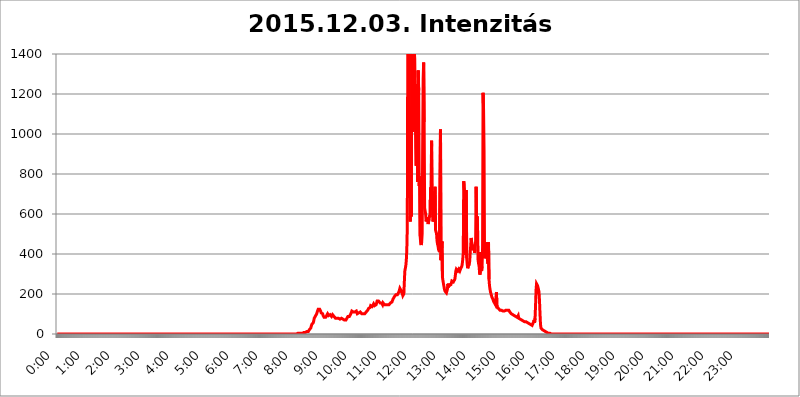
| Category | 2015.12.03. Intenzitás [W/m^2] |
|---|---|
| 0.0 | 0 |
| 0.0006944444444444445 | 0 |
| 0.001388888888888889 | 0 |
| 0.0020833333333333333 | 0 |
| 0.002777777777777778 | 0 |
| 0.003472222222222222 | 0 |
| 0.004166666666666667 | 0 |
| 0.004861111111111111 | 0 |
| 0.005555555555555556 | 0 |
| 0.0062499999999999995 | 0 |
| 0.006944444444444444 | 0 |
| 0.007638888888888889 | 0 |
| 0.008333333333333333 | 0 |
| 0.009027777777777779 | 0 |
| 0.009722222222222222 | 0 |
| 0.010416666666666666 | 0 |
| 0.011111111111111112 | 0 |
| 0.011805555555555555 | 0 |
| 0.012499999999999999 | 0 |
| 0.013194444444444444 | 0 |
| 0.013888888888888888 | 0 |
| 0.014583333333333332 | 0 |
| 0.015277777777777777 | 0 |
| 0.015972222222222224 | 0 |
| 0.016666666666666666 | 0 |
| 0.017361111111111112 | 0 |
| 0.018055555555555557 | 0 |
| 0.01875 | 0 |
| 0.019444444444444445 | 0 |
| 0.02013888888888889 | 0 |
| 0.020833333333333332 | 0 |
| 0.02152777777777778 | 0 |
| 0.022222222222222223 | 0 |
| 0.02291666666666667 | 0 |
| 0.02361111111111111 | 0 |
| 0.024305555555555556 | 0 |
| 0.024999999999999998 | 0 |
| 0.025694444444444447 | 0 |
| 0.02638888888888889 | 0 |
| 0.027083333333333334 | 0 |
| 0.027777777777777776 | 0 |
| 0.02847222222222222 | 0 |
| 0.029166666666666664 | 0 |
| 0.029861111111111113 | 0 |
| 0.030555555555555555 | 0 |
| 0.03125 | 0 |
| 0.03194444444444445 | 0 |
| 0.03263888888888889 | 0 |
| 0.03333333333333333 | 0 |
| 0.034027777777777775 | 0 |
| 0.034722222222222224 | 0 |
| 0.035416666666666666 | 0 |
| 0.036111111111111115 | 0 |
| 0.03680555555555556 | 0 |
| 0.0375 | 0 |
| 0.03819444444444444 | 0 |
| 0.03888888888888889 | 0 |
| 0.03958333333333333 | 0 |
| 0.04027777777777778 | 0 |
| 0.04097222222222222 | 0 |
| 0.041666666666666664 | 0 |
| 0.042361111111111106 | 0 |
| 0.04305555555555556 | 0 |
| 0.043750000000000004 | 0 |
| 0.044444444444444446 | 0 |
| 0.04513888888888889 | 0 |
| 0.04583333333333334 | 0 |
| 0.04652777777777778 | 0 |
| 0.04722222222222222 | 0 |
| 0.04791666666666666 | 0 |
| 0.04861111111111111 | 0 |
| 0.049305555555555554 | 0 |
| 0.049999999999999996 | 0 |
| 0.05069444444444445 | 0 |
| 0.051388888888888894 | 0 |
| 0.052083333333333336 | 0 |
| 0.05277777777777778 | 0 |
| 0.05347222222222222 | 0 |
| 0.05416666666666667 | 0 |
| 0.05486111111111111 | 0 |
| 0.05555555555555555 | 0 |
| 0.05625 | 0 |
| 0.05694444444444444 | 0 |
| 0.057638888888888885 | 0 |
| 0.05833333333333333 | 0 |
| 0.05902777777777778 | 0 |
| 0.059722222222222225 | 0 |
| 0.06041666666666667 | 0 |
| 0.061111111111111116 | 0 |
| 0.06180555555555556 | 0 |
| 0.0625 | 0 |
| 0.06319444444444444 | 0 |
| 0.06388888888888888 | 0 |
| 0.06458333333333334 | 0 |
| 0.06527777777777778 | 0 |
| 0.06597222222222222 | 0 |
| 0.06666666666666667 | 0 |
| 0.06736111111111111 | 0 |
| 0.06805555555555555 | 0 |
| 0.06874999999999999 | 0 |
| 0.06944444444444443 | 0 |
| 0.07013888888888889 | 0 |
| 0.07083333333333333 | 0 |
| 0.07152777777777779 | 0 |
| 0.07222222222222223 | 0 |
| 0.07291666666666667 | 0 |
| 0.07361111111111111 | 0 |
| 0.07430555555555556 | 0 |
| 0.075 | 0 |
| 0.07569444444444444 | 0 |
| 0.0763888888888889 | 0 |
| 0.07708333333333334 | 0 |
| 0.07777777777777778 | 0 |
| 0.07847222222222222 | 0 |
| 0.07916666666666666 | 0 |
| 0.0798611111111111 | 0 |
| 0.08055555555555556 | 0 |
| 0.08125 | 0 |
| 0.08194444444444444 | 0 |
| 0.08263888888888889 | 0 |
| 0.08333333333333333 | 0 |
| 0.08402777777777777 | 0 |
| 0.08472222222222221 | 0 |
| 0.08541666666666665 | 0 |
| 0.08611111111111112 | 0 |
| 0.08680555555555557 | 0 |
| 0.08750000000000001 | 0 |
| 0.08819444444444445 | 0 |
| 0.08888888888888889 | 0 |
| 0.08958333333333333 | 0 |
| 0.09027777777777778 | 0 |
| 0.09097222222222222 | 0 |
| 0.09166666666666667 | 0 |
| 0.09236111111111112 | 0 |
| 0.09305555555555556 | 0 |
| 0.09375 | 0 |
| 0.09444444444444444 | 0 |
| 0.09513888888888888 | 0 |
| 0.09583333333333333 | 0 |
| 0.09652777777777777 | 0 |
| 0.09722222222222222 | 0 |
| 0.09791666666666667 | 0 |
| 0.09861111111111111 | 0 |
| 0.09930555555555555 | 0 |
| 0.09999999999999999 | 0 |
| 0.10069444444444443 | 0 |
| 0.1013888888888889 | 0 |
| 0.10208333333333335 | 0 |
| 0.10277777777777779 | 0 |
| 0.10347222222222223 | 0 |
| 0.10416666666666667 | 0 |
| 0.10486111111111111 | 0 |
| 0.10555555555555556 | 0 |
| 0.10625 | 0 |
| 0.10694444444444444 | 0 |
| 0.1076388888888889 | 0 |
| 0.10833333333333334 | 0 |
| 0.10902777777777778 | 0 |
| 0.10972222222222222 | 0 |
| 0.1111111111111111 | 0 |
| 0.11180555555555556 | 0 |
| 0.11180555555555556 | 0 |
| 0.1125 | 0 |
| 0.11319444444444444 | 0 |
| 0.11388888888888889 | 0 |
| 0.11458333333333333 | 0 |
| 0.11527777777777777 | 0 |
| 0.11597222222222221 | 0 |
| 0.11666666666666665 | 0 |
| 0.1173611111111111 | 0 |
| 0.11805555555555557 | 0 |
| 0.11944444444444445 | 0 |
| 0.12013888888888889 | 0 |
| 0.12083333333333333 | 0 |
| 0.12152777777777778 | 0 |
| 0.12222222222222223 | 0 |
| 0.12291666666666667 | 0 |
| 0.12291666666666667 | 0 |
| 0.12361111111111112 | 0 |
| 0.12430555555555556 | 0 |
| 0.125 | 0 |
| 0.12569444444444444 | 0 |
| 0.12638888888888888 | 0 |
| 0.12708333333333333 | 0 |
| 0.16875 | 0 |
| 0.12847222222222224 | 0 |
| 0.12916666666666668 | 0 |
| 0.12986111111111112 | 0 |
| 0.13055555555555556 | 0 |
| 0.13125 | 0 |
| 0.13194444444444445 | 0 |
| 0.1326388888888889 | 0 |
| 0.13333333333333333 | 0 |
| 0.13402777777777777 | 0 |
| 0.13402777777777777 | 0 |
| 0.13472222222222222 | 0 |
| 0.13541666666666666 | 0 |
| 0.1361111111111111 | 0 |
| 0.13749999999999998 | 0 |
| 0.13819444444444443 | 0 |
| 0.1388888888888889 | 0 |
| 0.13958333333333334 | 0 |
| 0.14027777777777778 | 0 |
| 0.14097222222222222 | 0 |
| 0.14166666666666666 | 0 |
| 0.1423611111111111 | 0 |
| 0.14305555555555557 | 0 |
| 0.14375000000000002 | 0 |
| 0.14444444444444446 | 0 |
| 0.1451388888888889 | 0 |
| 0.1451388888888889 | 0 |
| 0.14652777777777778 | 0 |
| 0.14722222222222223 | 0 |
| 0.14791666666666667 | 0 |
| 0.1486111111111111 | 0 |
| 0.14930555555555555 | 0 |
| 0.15 | 0 |
| 0.15069444444444444 | 0 |
| 0.15138888888888888 | 0 |
| 0.15208333333333332 | 0 |
| 0.15277777777777776 | 0 |
| 0.15347222222222223 | 0 |
| 0.15416666666666667 | 0 |
| 0.15486111111111112 | 0 |
| 0.15555555555555556 | 0 |
| 0.15625 | 0 |
| 0.15694444444444444 | 0 |
| 0.15763888888888888 | 0 |
| 0.15833333333333333 | 0 |
| 0.15902777777777777 | 0 |
| 0.15972222222222224 | 0 |
| 0.16041666666666668 | 0 |
| 0.16111111111111112 | 0 |
| 0.16180555555555556 | 0 |
| 0.1625 | 0 |
| 0.16319444444444445 | 0 |
| 0.1638888888888889 | 0 |
| 0.16458333333333333 | 0 |
| 0.16527777777777777 | 0 |
| 0.16597222222222222 | 0 |
| 0.16666666666666666 | 0 |
| 0.1673611111111111 | 0 |
| 0.16805555555555554 | 0 |
| 0.16874999999999998 | 0 |
| 0.16944444444444443 | 0 |
| 0.17013888888888887 | 0 |
| 0.1708333333333333 | 0 |
| 0.17152777777777775 | 0 |
| 0.17222222222222225 | 0 |
| 0.1729166666666667 | 0 |
| 0.17361111111111113 | 0 |
| 0.17430555555555557 | 0 |
| 0.17500000000000002 | 0 |
| 0.17569444444444446 | 0 |
| 0.1763888888888889 | 0 |
| 0.17708333333333334 | 0 |
| 0.17777777777777778 | 0 |
| 0.17847222222222223 | 0 |
| 0.17916666666666667 | 0 |
| 0.1798611111111111 | 0 |
| 0.18055555555555555 | 0 |
| 0.18125 | 0 |
| 0.18194444444444444 | 0 |
| 0.1826388888888889 | 0 |
| 0.18333333333333335 | 0 |
| 0.1840277777777778 | 0 |
| 0.18472222222222223 | 0 |
| 0.18541666666666667 | 0 |
| 0.18611111111111112 | 0 |
| 0.18680555555555556 | 0 |
| 0.1875 | 0 |
| 0.18819444444444444 | 0 |
| 0.18888888888888888 | 0 |
| 0.18958333333333333 | 0 |
| 0.19027777777777777 | 0 |
| 0.1909722222222222 | 0 |
| 0.19166666666666665 | 0 |
| 0.19236111111111112 | 0 |
| 0.19305555555555554 | 0 |
| 0.19375 | 0 |
| 0.19444444444444445 | 0 |
| 0.1951388888888889 | 0 |
| 0.19583333333333333 | 0 |
| 0.19652777777777777 | 0 |
| 0.19722222222222222 | 0 |
| 0.19791666666666666 | 0 |
| 0.1986111111111111 | 0 |
| 0.19930555555555554 | 0 |
| 0.19999999999999998 | 0 |
| 0.20069444444444443 | 0 |
| 0.20138888888888887 | 0 |
| 0.2020833333333333 | 0 |
| 0.2027777777777778 | 0 |
| 0.2034722222222222 | 0 |
| 0.2041666666666667 | 0 |
| 0.20486111111111113 | 0 |
| 0.20555555555555557 | 0 |
| 0.20625000000000002 | 0 |
| 0.20694444444444446 | 0 |
| 0.2076388888888889 | 0 |
| 0.20833333333333334 | 0 |
| 0.20902777777777778 | 0 |
| 0.20972222222222223 | 0 |
| 0.21041666666666667 | 0 |
| 0.2111111111111111 | 0 |
| 0.21180555555555555 | 0 |
| 0.2125 | 0 |
| 0.21319444444444444 | 0 |
| 0.2138888888888889 | 0 |
| 0.21458333333333335 | 0 |
| 0.2152777777777778 | 0 |
| 0.21597222222222223 | 0 |
| 0.21666666666666667 | 0 |
| 0.21736111111111112 | 0 |
| 0.21805555555555556 | 0 |
| 0.21875 | 0 |
| 0.21944444444444444 | 0 |
| 0.22013888888888888 | 0 |
| 0.22083333333333333 | 0 |
| 0.22152777777777777 | 0 |
| 0.2222222222222222 | 0 |
| 0.22291666666666665 | 0 |
| 0.2236111111111111 | 0 |
| 0.22430555555555556 | 0 |
| 0.225 | 0 |
| 0.22569444444444445 | 0 |
| 0.2263888888888889 | 0 |
| 0.22708333333333333 | 0 |
| 0.22777777777777777 | 0 |
| 0.22847222222222222 | 0 |
| 0.22916666666666666 | 0 |
| 0.2298611111111111 | 0 |
| 0.23055555555555554 | 0 |
| 0.23124999999999998 | 0 |
| 0.23194444444444443 | 0 |
| 0.23263888888888887 | 0 |
| 0.2333333333333333 | 0 |
| 0.2340277777777778 | 0 |
| 0.2347222222222222 | 0 |
| 0.2354166666666667 | 0 |
| 0.23611111111111113 | 0 |
| 0.23680555555555557 | 0 |
| 0.23750000000000002 | 0 |
| 0.23819444444444446 | 0 |
| 0.2388888888888889 | 0 |
| 0.23958333333333334 | 0 |
| 0.24027777777777778 | 0 |
| 0.24097222222222223 | 0 |
| 0.24166666666666667 | 0 |
| 0.2423611111111111 | 0 |
| 0.24305555555555555 | 0 |
| 0.24375 | 0 |
| 0.24444444444444446 | 0 |
| 0.24513888888888888 | 0 |
| 0.24583333333333335 | 0 |
| 0.2465277777777778 | 0 |
| 0.24722222222222223 | 0 |
| 0.24791666666666667 | 0 |
| 0.24861111111111112 | 0 |
| 0.24930555555555556 | 0 |
| 0.25 | 0 |
| 0.25069444444444444 | 0 |
| 0.2513888888888889 | 0 |
| 0.2520833333333333 | 0 |
| 0.25277777777777777 | 0 |
| 0.2534722222222222 | 0 |
| 0.25416666666666665 | 0 |
| 0.2548611111111111 | 0 |
| 0.2555555555555556 | 0 |
| 0.25625000000000003 | 0 |
| 0.2569444444444445 | 0 |
| 0.2576388888888889 | 0 |
| 0.25833333333333336 | 0 |
| 0.2590277777777778 | 0 |
| 0.25972222222222224 | 0 |
| 0.2604166666666667 | 0 |
| 0.2611111111111111 | 0 |
| 0.26180555555555557 | 0 |
| 0.2625 | 0 |
| 0.26319444444444445 | 0 |
| 0.2638888888888889 | 0 |
| 0.26458333333333334 | 0 |
| 0.2652777777777778 | 0 |
| 0.2659722222222222 | 0 |
| 0.26666666666666666 | 0 |
| 0.2673611111111111 | 0 |
| 0.26805555555555555 | 0 |
| 0.26875 | 0 |
| 0.26944444444444443 | 0 |
| 0.2701388888888889 | 0 |
| 0.2708333333333333 | 0 |
| 0.27152777777777776 | 0 |
| 0.2722222222222222 | 0 |
| 0.27291666666666664 | 0 |
| 0.2736111111111111 | 0 |
| 0.2743055555555555 | 0 |
| 0.27499999999999997 | 0 |
| 0.27569444444444446 | 0 |
| 0.27638888888888885 | 0 |
| 0.27708333333333335 | 0 |
| 0.2777777777777778 | 0 |
| 0.27847222222222223 | 0 |
| 0.2791666666666667 | 0 |
| 0.2798611111111111 | 0 |
| 0.28055555555555556 | 0 |
| 0.28125 | 0 |
| 0.28194444444444444 | 0 |
| 0.2826388888888889 | 0 |
| 0.2833333333333333 | 0 |
| 0.28402777777777777 | 0 |
| 0.2847222222222222 | 0 |
| 0.28541666666666665 | 0 |
| 0.28611111111111115 | 0 |
| 0.28680555555555554 | 0 |
| 0.28750000000000003 | 0 |
| 0.2881944444444445 | 0 |
| 0.2888888888888889 | 0 |
| 0.28958333333333336 | 0 |
| 0.2902777777777778 | 0 |
| 0.29097222222222224 | 0 |
| 0.2916666666666667 | 0 |
| 0.2923611111111111 | 0 |
| 0.29305555555555557 | 0 |
| 0.29375 | 0 |
| 0.29444444444444445 | 0 |
| 0.2951388888888889 | 0 |
| 0.29583333333333334 | 0 |
| 0.2965277777777778 | 0 |
| 0.2972222222222222 | 0 |
| 0.29791666666666666 | 0 |
| 0.2986111111111111 | 0 |
| 0.29930555555555555 | 0 |
| 0.3 | 0 |
| 0.30069444444444443 | 0 |
| 0.3013888888888889 | 0 |
| 0.3020833333333333 | 0 |
| 0.30277777777777776 | 0 |
| 0.3034722222222222 | 0 |
| 0.30416666666666664 | 0 |
| 0.3048611111111111 | 0 |
| 0.3055555555555555 | 0 |
| 0.30624999999999997 | 0 |
| 0.3069444444444444 | 0 |
| 0.3076388888888889 | 0 |
| 0.30833333333333335 | 0 |
| 0.3090277777777778 | 0 |
| 0.30972222222222223 | 0 |
| 0.3104166666666667 | 0 |
| 0.3111111111111111 | 0 |
| 0.31180555555555556 | 0 |
| 0.3125 | 0 |
| 0.31319444444444444 | 0 |
| 0.3138888888888889 | 0 |
| 0.3145833333333333 | 0 |
| 0.31527777777777777 | 0 |
| 0.3159722222222222 | 0 |
| 0.31666666666666665 | 0 |
| 0.31736111111111115 | 0 |
| 0.31805555555555554 | 0 |
| 0.31875000000000003 | 0 |
| 0.3194444444444445 | 0 |
| 0.3201388888888889 | 0 |
| 0.32083333333333336 | 0 |
| 0.3215277777777778 | 0 |
| 0.32222222222222224 | 0 |
| 0.3229166666666667 | 0 |
| 0.3236111111111111 | 0 |
| 0.32430555555555557 | 0 |
| 0.325 | 0 |
| 0.32569444444444445 | 0 |
| 0.3263888888888889 | 0 |
| 0.32708333333333334 | 0 |
| 0.3277777777777778 | 0 |
| 0.3284722222222222 | 0 |
| 0.32916666666666666 | 0 |
| 0.3298611111111111 | 0 |
| 0.33055555555555555 | 0 |
| 0.33125 | 0 |
| 0.33194444444444443 | 0 |
| 0.3326388888888889 | 0 |
| 0.3333333333333333 | 0 |
| 0.3340277777777778 | 0 |
| 0.3347222222222222 | 0 |
| 0.3354166666666667 | 0 |
| 0.3361111111111111 | 0 |
| 0.3368055555555556 | 3.525 |
| 0.33749999999999997 | 3.525 |
| 0.33819444444444446 | 3.525 |
| 0.33888888888888885 | 3.525 |
| 0.33958333333333335 | 3.525 |
| 0.34027777777777773 | 3.525 |
| 0.34097222222222223 | 3.525 |
| 0.3416666666666666 | 3.525 |
| 0.3423611111111111 | 3.525 |
| 0.3430555555555555 | 3.525 |
| 0.34375 | 3.525 |
| 0.3444444444444445 | 3.525 |
| 0.3451388888888889 | 7.887 |
| 0.3458333333333334 | 7.887 |
| 0.34652777777777777 | 7.887 |
| 0.34722222222222227 | 7.887 |
| 0.34791666666666665 | 7.887 |
| 0.34861111111111115 | 12.257 |
| 0.34930555555555554 | 12.257 |
| 0.35000000000000003 | 12.257 |
| 0.3506944444444444 | 12.257 |
| 0.3513888888888889 | 12.257 |
| 0.3520833333333333 | 12.257 |
| 0.3527777777777778 | 16.636 |
| 0.3534722222222222 | 21.024 |
| 0.3541666666666667 | 21.024 |
| 0.3548611111111111 | 25.419 |
| 0.35555555555555557 | 29.823 |
| 0.35625 | 38.653 |
| 0.35694444444444445 | 47.511 |
| 0.3576388888888889 | 51.951 |
| 0.35833333333333334 | 51.951 |
| 0.3590277777777778 | 56.398 |
| 0.3597222222222222 | 65.31 |
| 0.36041666666666666 | 78.722 |
| 0.3611111111111111 | 83.205 |
| 0.36180555555555555 | 87.692 |
| 0.3625 | 92.184 |
| 0.36319444444444443 | 92.184 |
| 0.3638888888888889 | 101.184 |
| 0.3645833333333333 | 110.201 |
| 0.3652777777777778 | 114.716 |
| 0.3659722222222222 | 123.758 |
| 0.3666666666666667 | 123.758 |
| 0.3673611111111111 | 128.284 |
| 0.3680555555555556 | 123.758 |
| 0.36874999999999997 | 119.235 |
| 0.36944444444444446 | 114.716 |
| 0.37013888888888885 | 105.69 |
| 0.37083333333333335 | 105.69 |
| 0.37152777777777773 | 105.69 |
| 0.37222222222222223 | 101.184 |
| 0.3729166666666666 | 92.184 |
| 0.3736111111111111 | 87.692 |
| 0.3743055555555555 | 83.205 |
| 0.375 | 87.692 |
| 0.3756944444444445 | 83.205 |
| 0.3763888888888889 | 83.205 |
| 0.3770833333333334 | 83.205 |
| 0.37777777777777777 | 92.184 |
| 0.37847222222222227 | 96.682 |
| 0.37916666666666665 | 101.184 |
| 0.37986111111111115 | 101.184 |
| 0.38055555555555554 | 92.184 |
| 0.38125000000000003 | 92.184 |
| 0.3819444444444444 | 96.682 |
| 0.3826388888888889 | 96.682 |
| 0.3833333333333333 | 96.682 |
| 0.3840277777777778 | 92.184 |
| 0.3847222222222222 | 87.692 |
| 0.3854166666666667 | 92.184 |
| 0.3861111111111111 | 96.682 |
| 0.38680555555555557 | 96.682 |
| 0.3875 | 92.184 |
| 0.38819444444444445 | 87.692 |
| 0.3888888888888889 | 87.692 |
| 0.38958333333333334 | 83.205 |
| 0.3902777777777778 | 78.722 |
| 0.3909722222222222 | 78.722 |
| 0.39166666666666666 | 78.722 |
| 0.3923611111111111 | 78.722 |
| 0.39305555555555555 | 74.246 |
| 0.39375 | 74.246 |
| 0.39444444444444443 | 78.722 |
| 0.3951388888888889 | 78.722 |
| 0.3958333333333333 | 74.246 |
| 0.3965277777777778 | 74.246 |
| 0.3972222222222222 | 74.246 |
| 0.3979166666666667 | 74.246 |
| 0.3986111111111111 | 78.722 |
| 0.3993055555555556 | 78.722 |
| 0.39999999999999997 | 78.722 |
| 0.40069444444444446 | 74.246 |
| 0.40138888888888885 | 74.246 |
| 0.40208333333333335 | 69.775 |
| 0.40277777777777773 | 69.775 |
| 0.40347222222222223 | 69.775 |
| 0.4041666666666666 | 65.31 |
| 0.4048611111111111 | 69.775 |
| 0.4055555555555555 | 74.246 |
| 0.40625 | 78.722 |
| 0.4069444444444445 | 83.205 |
| 0.4076388888888889 | 87.692 |
| 0.4083333333333334 | 83.205 |
| 0.40902777777777777 | 83.205 |
| 0.40972222222222227 | 87.692 |
| 0.41041666666666665 | 87.692 |
| 0.41111111111111115 | 92.184 |
| 0.41180555555555554 | 101.184 |
| 0.41250000000000003 | 105.69 |
| 0.4131944444444444 | 114.716 |
| 0.4138888888888889 | 114.716 |
| 0.4145833333333333 | 114.716 |
| 0.4152777777777778 | 110.201 |
| 0.4159722222222222 | 105.69 |
| 0.4166666666666667 | 105.69 |
| 0.4173611111111111 | 110.201 |
| 0.41805555555555557 | 110.201 |
| 0.41875 | 114.716 |
| 0.41944444444444445 | 114.716 |
| 0.4201388888888889 | 110.201 |
| 0.42083333333333334 | 101.184 |
| 0.4215277777777778 | 101.184 |
| 0.4222222222222222 | 101.184 |
| 0.42291666666666666 | 105.69 |
| 0.4236111111111111 | 101.184 |
| 0.42430555555555555 | 105.69 |
| 0.425 | 110.201 |
| 0.42569444444444443 | 105.69 |
| 0.4263888888888889 | 105.69 |
| 0.4270833333333333 | 101.184 |
| 0.4277777777777778 | 105.69 |
| 0.4284722222222222 | 101.184 |
| 0.4291666666666667 | 101.184 |
| 0.4298611111111111 | 105.69 |
| 0.4305555555555556 | 101.184 |
| 0.43124999999999997 | 101.184 |
| 0.43194444444444446 | 96.682 |
| 0.43263888888888885 | 105.69 |
| 0.43333333333333335 | 110.201 |
| 0.43402777777777773 | 114.716 |
| 0.43472222222222223 | 114.716 |
| 0.4354166666666666 | 119.235 |
| 0.4361111111111111 | 123.758 |
| 0.4368055555555555 | 128.284 |
| 0.4375 | 128.284 |
| 0.4381944444444445 | 128.284 |
| 0.4388888888888889 | 132.814 |
| 0.4395833333333334 | 141.884 |
| 0.44027777777777777 | 141.884 |
| 0.44097222222222227 | 137.347 |
| 0.44166666666666665 | 137.347 |
| 0.44236111111111115 | 137.347 |
| 0.44305555555555554 | 141.884 |
| 0.44375000000000003 | 150.964 |
| 0.4444444444444444 | 150.964 |
| 0.4451388888888889 | 141.884 |
| 0.4458333333333333 | 141.884 |
| 0.4465277777777778 | 146.423 |
| 0.4472222222222222 | 146.423 |
| 0.4479166666666667 | 155.509 |
| 0.4486111111111111 | 164.605 |
| 0.44930555555555557 | 164.605 |
| 0.45 | 164.605 |
| 0.45069444444444445 | 164.605 |
| 0.4513888888888889 | 164.605 |
| 0.45208333333333334 | 160.056 |
| 0.4527777777777778 | 155.509 |
| 0.4534722222222222 | 155.509 |
| 0.45416666666666666 | 160.056 |
| 0.4548611111111111 | 155.509 |
| 0.45555555555555555 | 150.964 |
| 0.45625 | 146.423 |
| 0.45694444444444443 | 155.509 |
| 0.4576388888888889 | 150.964 |
| 0.4583333333333333 | 150.964 |
| 0.4590277777777778 | 146.423 |
| 0.4597222222222222 | 146.423 |
| 0.4604166666666667 | 146.423 |
| 0.4611111111111111 | 146.423 |
| 0.4618055555555556 | 146.423 |
| 0.46249999999999997 | 146.423 |
| 0.46319444444444446 | 146.423 |
| 0.46388888888888885 | 146.423 |
| 0.46458333333333335 | 141.884 |
| 0.46527777777777773 | 146.423 |
| 0.46597222222222223 | 150.964 |
| 0.4666666666666666 | 150.964 |
| 0.4673611111111111 | 155.509 |
| 0.4680555555555555 | 155.509 |
| 0.46875 | 160.056 |
| 0.4694444444444445 | 160.056 |
| 0.4701388888888889 | 164.605 |
| 0.4708333333333334 | 173.709 |
| 0.47152777777777777 | 173.709 |
| 0.47222222222222227 | 178.264 |
| 0.47291666666666665 | 187.378 |
| 0.47361111111111115 | 182.82 |
| 0.47430555555555554 | 182.82 |
| 0.47500000000000003 | 196.497 |
| 0.4756944444444444 | 201.058 |
| 0.4763888888888889 | 201.058 |
| 0.4770833333333333 | 196.497 |
| 0.4777777777777778 | 201.058 |
| 0.4784722222222222 | 201.058 |
| 0.4791666666666667 | 210.182 |
| 0.4798611111111111 | 214.746 |
| 0.48055555555555557 | 228.436 |
| 0.48125 | 228.436 |
| 0.48194444444444445 | 219.309 |
| 0.4826388888888889 | 219.309 |
| 0.48333333333333334 | 214.746 |
| 0.4840277777777778 | 201.058 |
| 0.4847222222222222 | 191.937 |
| 0.48541666666666666 | 191.937 |
| 0.4861111111111111 | 201.058 |
| 0.48680555555555555 | 260.373 |
| 0.4875 | 314.98 |
| 0.48819444444444443 | 319.517 |
| 0.4888888888888889 | 342.162 |
| 0.4895833333333333 | 369.23 |
| 0.4902777777777778 | 422.943 |
| 0.4909722222222222 | 541.121 |
| 0.4916666666666667 | 1539.476 |
| 0.4923611111111111 | 1528.717 |
| 0.4930555555555556 | 1486.851 |
| 0.49374999999999997 | 1461.58 |
| 0.49444444444444446 | 695.666 |
| 0.49513888888888885 | 562.53 |
| 0.49583333333333335 | 695.666 |
| 0.49652777777777773 | 588.009 |
| 0.49722222222222223 | 1491.985 |
| 0.4979166666666666 | 1154.814 |
| 0.4986111111111111 | 1011.118 |
| 0.4993055555555555 | 1427.268 |
| 0.5 | 1441.826 |
| 0.5006944444444444 | 1417.68 |
| 0.5013888888888889 | 1375.633 |
| 0.5020833333333333 | 1380.22 |
| 0.5027777777777778 | 928.819 |
| 0.5034722222222222 | 841.526 |
| 0.5041666666666667 | 1112.618 |
| 0.5048611111111111 | 1250.275 |
| 0.5055555555555555 | 759.723 |
| 0.50625 | 1317.736 |
| 0.5069444444444444 | 1217.812 |
| 0.5076388888888889 | 739.877 |
| 0.5083333333333333 | 787.258 |
| 0.5090277777777777 | 489.108 |
| 0.5097222222222222 | 453.968 |
| 0.5104166666666666 | 445.129 |
| 0.5111111111111112 | 458.38 |
| 0.5118055555555555 | 502.192 |
| 0.5125000000000001 | 936.33 |
| 0.5131944444444444 | 1275.142 |
| 0.513888888888889 | 1357.483 |
| 0.5145833333333333 | 1059.756 |
| 0.5152777777777778 | 629.948 |
| 0.5159722222222222 | 625.784 |
| 0.5166666666666667 | 600.661 |
| 0.517361111111111 | 562.53 |
| 0.5180555555555556 | 558.261 |
| 0.5187499999999999 | 583.779 |
| 0.5194444444444445 | 575.299 |
| 0.5201388888888888 | 549.704 |
| 0.5208333333333334 | 545.416 |
| 0.5215277777777778 | 575.299 |
| 0.5222222222222223 | 592.233 |
| 0.5229166666666667 | 583.779 |
| 0.5236111111111111 | 731.896 |
| 0.5243055555555556 | 621.613 |
| 0.525 | 966.295 |
| 0.5256944444444445 | 658.909 |
| 0.5263888888888889 | 711.832 |
| 0.5270833333333333 | 562.53 |
| 0.5277777777777778 | 571.049 |
| 0.5284722222222222 | 575.299 |
| 0.5291666666666667 | 621.613 |
| 0.5298611111111111 | 735.89 |
| 0.5305555555555556 | 519.555 |
| 0.53125 | 519.555 |
| 0.5319444444444444 | 502.192 |
| 0.5326388888888889 | 467.187 |
| 0.5333333333333333 | 449.551 |
| 0.5340277777777778 | 440.702 |
| 0.5347222222222222 | 422.943 |
| 0.5354166666666667 | 418.492 |
| 0.5361111111111111 | 409.574 |
| 0.5368055555555555 | 405.108 |
| 0.5375 | 1022.323 |
| 0.5381944444444444 | 369.23 |
| 0.5388888888888889 | 369.23 |
| 0.5395833333333333 | 462.786 |
| 0.5402777777777777 | 283.156 |
| 0.5409722222222222 | 283.156 |
| 0.5416666666666666 | 251.251 |
| 0.5423611111111112 | 237.564 |
| 0.5430555555555555 | 223.873 |
| 0.5437500000000001 | 214.746 |
| 0.5444444444444444 | 210.182 |
| 0.545138888888889 | 210.182 |
| 0.5458333333333333 | 205.62 |
| 0.5465277777777778 | 210.182 |
| 0.5472222222222222 | 223.873 |
| 0.5479166666666667 | 251.251 |
| 0.548611111111111 | 233 |
| 0.5493055555555556 | 251.251 |
| 0.5499999999999999 | 242.127 |
| 0.5506944444444445 | 246.689 |
| 0.5513888888888888 | 246.689 |
| 0.5520833333333334 | 246.689 |
| 0.5527777777777778 | 255.813 |
| 0.5534722222222223 | 264.932 |
| 0.5541666666666667 | 264.932 |
| 0.5548611111111111 | 260.373 |
| 0.5555555555555556 | 260.373 |
| 0.55625 | 260.373 |
| 0.5569444444444445 | 264.932 |
| 0.5576388888888889 | 274.047 |
| 0.5583333333333333 | 292.259 |
| 0.5590277777777778 | 314.98 |
| 0.5597222222222222 | 324.052 |
| 0.5604166666666667 | 324.052 |
| 0.5611111111111111 | 319.517 |
| 0.5618055555555556 | 314.98 |
| 0.5625 | 314.98 |
| 0.5631944444444444 | 324.052 |
| 0.5638888888888889 | 319.517 |
| 0.5645833333333333 | 314.98 |
| 0.5652777777777778 | 314.98 |
| 0.5659722222222222 | 328.584 |
| 0.5666666666666667 | 333.113 |
| 0.5673611111111111 | 337.639 |
| 0.5680555555555555 | 351.198 |
| 0.56875 | 373.729 |
| 0.5694444444444444 | 405.108 |
| 0.5701388888888889 | 763.674 |
| 0.5708333333333333 | 719.877 |
| 0.5715277777777777 | 528.2 |
| 0.5722222222222222 | 396.164 |
| 0.5729166666666666 | 711.832 |
| 0.5736111111111112 | 719.877 |
| 0.5743055555555555 | 378.224 |
| 0.5750000000000001 | 346.682 |
| 0.5756944444444444 | 328.584 |
| 0.576388888888889 | 337.639 |
| 0.5770833333333333 | 342.162 |
| 0.5777777777777778 | 346.682 |
| 0.5784722222222222 | 364.728 |
| 0.5791666666666667 | 405.108 |
| 0.579861111111111 | 440.702 |
| 0.5805555555555556 | 480.356 |
| 0.5812499999999999 | 458.38 |
| 0.5819444444444445 | 453.968 |
| 0.5826388888888888 | 440.702 |
| 0.5833333333333334 | 431.833 |
| 0.5840277777777778 | 418.492 |
| 0.5847222222222223 | 427.39 |
| 0.5854166666666667 | 405.108 |
| 0.5861111111111111 | 422.943 |
| 0.5868055555555556 | 467.187 |
| 0.5875 | 735.89 |
| 0.5881944444444445 | 553.986 |
| 0.5888888888888889 | 588.009 |
| 0.5895833333333333 | 519.555 |
| 0.5902777777777778 | 369.23 |
| 0.5909722222222222 | 351.198 |
| 0.5916666666666667 | 337.639 |
| 0.5923611111111111 | 305.898 |
| 0.5930555555555556 | 296.808 |
| 0.59375 | 409.574 |
| 0.5944444444444444 | 328.584 |
| 0.5951388888888889 | 314.98 |
| 0.5958333333333333 | 337.639 |
| 0.5965277777777778 | 436.27 |
| 0.5972222222222222 | 1205.82 |
| 0.5979166666666667 | 1124.056 |
| 0.5986111111111111 | 917.534 |
| 0.5993055555555555 | 378.224 |
| 0.6 | 391.685 |
| 0.6006944444444444 | 422.943 |
| 0.6013888888888889 | 436.27 |
| 0.6020833333333333 | 458.38 |
| 0.6027777777777777 | 462.786 |
| 0.6034722222222222 | 369.23 |
| 0.6041666666666666 | 351.198 |
| 0.6048611111111112 | 458.38 |
| 0.6055555555555555 | 274.047 |
| 0.6062500000000001 | 242.127 |
| 0.6069444444444444 | 223.873 |
| 0.607638888888889 | 210.182 |
| 0.6083333333333333 | 201.058 |
| 0.6090277777777778 | 191.937 |
| 0.6097222222222222 | 182.82 |
| 0.6104166666666667 | 178.264 |
| 0.611111111111111 | 173.709 |
| 0.6118055555555556 | 164.605 |
| 0.6124999999999999 | 160.056 |
| 0.6131944444444445 | 155.509 |
| 0.6138888888888888 | 150.964 |
| 0.6145833333333334 | 146.423 |
| 0.6152777777777778 | 150.964 |
| 0.6159722222222223 | 210.182 |
| 0.6166666666666667 | 137.347 |
| 0.6173611111111111 | 137.347 |
| 0.6180555555555556 | 132.814 |
| 0.61875 | 128.284 |
| 0.6194444444444445 | 123.758 |
| 0.6201388888888889 | 123.758 |
| 0.6208333333333333 | 119.235 |
| 0.6215277777777778 | 119.235 |
| 0.6222222222222222 | 119.235 |
| 0.6229166666666667 | 119.235 |
| 0.6236111111111111 | 119.235 |
| 0.6243055555555556 | 114.716 |
| 0.625 | 114.716 |
| 0.6256944444444444 | 114.716 |
| 0.6263888888888889 | 114.716 |
| 0.6270833333333333 | 114.716 |
| 0.6277777777777778 | 119.235 |
| 0.6284722222222222 | 119.235 |
| 0.6291666666666667 | 119.235 |
| 0.6298611111111111 | 119.235 |
| 0.6305555555555555 | 119.235 |
| 0.63125 | 119.235 |
| 0.6319444444444444 | 119.235 |
| 0.6326388888888889 | 119.235 |
| 0.6333333333333333 | 119.235 |
| 0.6340277777777777 | 114.716 |
| 0.6347222222222222 | 110.201 |
| 0.6354166666666666 | 110.201 |
| 0.6361111111111112 | 105.69 |
| 0.6368055555555555 | 101.184 |
| 0.6375000000000001 | 101.184 |
| 0.6381944444444444 | 101.184 |
| 0.638888888888889 | 96.682 |
| 0.6395833333333333 | 96.682 |
| 0.6402777777777778 | 96.682 |
| 0.6409722222222222 | 92.184 |
| 0.6416666666666667 | 92.184 |
| 0.642361111111111 | 87.692 |
| 0.6430555555555556 | 87.692 |
| 0.6437499999999999 | 87.692 |
| 0.6444444444444445 | 83.205 |
| 0.6451388888888888 | 83.205 |
| 0.6458333333333334 | 83.205 |
| 0.6465277777777778 | 92.184 |
| 0.6472222222222223 | 78.722 |
| 0.6479166666666667 | 78.722 |
| 0.6486111111111111 | 74.246 |
| 0.6493055555555556 | 74.246 |
| 0.65 | 69.775 |
| 0.6506944444444445 | 69.775 |
| 0.6513888888888889 | 69.775 |
| 0.6520833333333333 | 69.775 |
| 0.6527777777777778 | 65.31 |
| 0.6534722222222222 | 65.31 |
| 0.6541666666666667 | 65.31 |
| 0.6548611111111111 | 65.31 |
| 0.6555555555555556 | 60.85 |
| 0.65625 | 60.85 |
| 0.6569444444444444 | 60.85 |
| 0.6576388888888889 | 60.85 |
| 0.6583333333333333 | 56.398 |
| 0.6590277777777778 | 56.398 |
| 0.6597222222222222 | 56.398 |
| 0.6604166666666667 | 56.398 |
| 0.6611111111111111 | 51.951 |
| 0.6618055555555555 | 51.951 |
| 0.6625 | 47.511 |
| 0.6631944444444444 | 47.511 |
| 0.6638888888888889 | 47.511 |
| 0.6645833333333333 | 47.511 |
| 0.6652777777777777 | 47.511 |
| 0.6659722222222222 | 43.079 |
| 0.6666666666666666 | 43.079 |
| 0.6673611111111111 | 47.511 |
| 0.6680555555555556 | 60.85 |
| 0.6687500000000001 | 69.775 |
| 0.6694444444444444 | 56.398 |
| 0.6701388888888888 | 78.722 |
| 0.6708333333333334 | 141.884 |
| 0.6715277777777778 | 219.309 |
| 0.6722222222222222 | 251.251 |
| 0.6729166666666666 | 255.813 |
| 0.6736111111111112 | 242.127 |
| 0.6743055555555556 | 233 |
| 0.6749999999999999 | 228.436 |
| 0.6756944444444444 | 210.182 |
| 0.6763888888888889 | 164.605 |
| 0.6770833333333334 | 101.184 |
| 0.6777777777777777 | 47.511 |
| 0.6784722222222223 | 29.823 |
| 0.6791666666666667 | 25.419 |
| 0.6798611111111111 | 25.419 |
| 0.6805555555555555 | 21.024 |
| 0.68125 | 21.024 |
| 0.6819444444444445 | 21.024 |
| 0.6826388888888889 | 16.636 |
| 0.6833333333333332 | 16.636 |
| 0.6840277777777778 | 16.636 |
| 0.6847222222222222 | 12.257 |
| 0.6854166666666667 | 12.257 |
| 0.686111111111111 | 12.257 |
| 0.6868055555555556 | 7.887 |
| 0.6875 | 7.887 |
| 0.6881944444444444 | 7.887 |
| 0.688888888888889 | 3.525 |
| 0.6895833333333333 | 3.525 |
| 0.6902777777777778 | 3.525 |
| 0.6909722222222222 | 3.525 |
| 0.6916666666666668 | 3.525 |
| 0.6923611111111111 | 3.525 |
| 0.6930555555555555 | 0 |
| 0.69375 | 0 |
| 0.6944444444444445 | 0 |
| 0.6951388888888889 | 0 |
| 0.6958333333333333 | 0 |
| 0.6965277777777777 | 0 |
| 0.6972222222222223 | 0 |
| 0.6979166666666666 | 0 |
| 0.6986111111111111 | 0 |
| 0.6993055555555556 | 0 |
| 0.7000000000000001 | 0 |
| 0.7006944444444444 | 0 |
| 0.7013888888888888 | 0 |
| 0.7020833333333334 | 0 |
| 0.7027777777777778 | 0 |
| 0.7034722222222222 | 0 |
| 0.7041666666666666 | 0 |
| 0.7048611111111112 | 0 |
| 0.7055555555555556 | 0 |
| 0.7062499999999999 | 0 |
| 0.7069444444444444 | 0 |
| 0.7076388888888889 | 0 |
| 0.7083333333333334 | 0 |
| 0.7090277777777777 | 0 |
| 0.7097222222222223 | 0 |
| 0.7104166666666667 | 0 |
| 0.7111111111111111 | 0 |
| 0.7118055555555555 | 0 |
| 0.7125 | 0 |
| 0.7131944444444445 | 0 |
| 0.7138888888888889 | 0 |
| 0.7145833333333332 | 0 |
| 0.7152777777777778 | 0 |
| 0.7159722222222222 | 0 |
| 0.7166666666666667 | 0 |
| 0.717361111111111 | 0 |
| 0.7180555555555556 | 0 |
| 0.71875 | 0 |
| 0.7194444444444444 | 0 |
| 0.720138888888889 | 0 |
| 0.7208333333333333 | 0 |
| 0.7215277777777778 | 0 |
| 0.7222222222222222 | 0 |
| 0.7229166666666668 | 0 |
| 0.7236111111111111 | 0 |
| 0.7243055555555555 | 0 |
| 0.725 | 0 |
| 0.7256944444444445 | 0 |
| 0.7263888888888889 | 0 |
| 0.7270833333333333 | 0 |
| 0.7277777777777777 | 0 |
| 0.7284722222222223 | 0 |
| 0.7291666666666666 | 0 |
| 0.7298611111111111 | 0 |
| 0.7305555555555556 | 0 |
| 0.7312500000000001 | 0 |
| 0.7319444444444444 | 0 |
| 0.7326388888888888 | 0 |
| 0.7333333333333334 | 0 |
| 0.7340277777777778 | 0 |
| 0.7347222222222222 | 0 |
| 0.7354166666666666 | 0 |
| 0.7361111111111112 | 0 |
| 0.7368055555555556 | 0 |
| 0.7374999999999999 | 0 |
| 0.7381944444444444 | 0 |
| 0.7388888888888889 | 0 |
| 0.7395833333333334 | 0 |
| 0.7402777777777777 | 0 |
| 0.7409722222222223 | 0 |
| 0.7416666666666667 | 0 |
| 0.7423611111111111 | 0 |
| 0.7430555555555555 | 0 |
| 0.74375 | 0 |
| 0.7444444444444445 | 0 |
| 0.7451388888888889 | 0 |
| 0.7458333333333332 | 0 |
| 0.7465277777777778 | 0 |
| 0.7472222222222222 | 0 |
| 0.7479166666666667 | 0 |
| 0.748611111111111 | 0 |
| 0.7493055555555556 | 0 |
| 0.75 | 0 |
| 0.7506944444444444 | 0 |
| 0.751388888888889 | 0 |
| 0.7520833333333333 | 0 |
| 0.7527777777777778 | 0 |
| 0.7534722222222222 | 0 |
| 0.7541666666666668 | 0 |
| 0.7548611111111111 | 0 |
| 0.7555555555555555 | 0 |
| 0.75625 | 0 |
| 0.7569444444444445 | 0 |
| 0.7576388888888889 | 0 |
| 0.7583333333333333 | 0 |
| 0.7590277777777777 | 0 |
| 0.7597222222222223 | 0 |
| 0.7604166666666666 | 0 |
| 0.7611111111111111 | 0 |
| 0.7618055555555556 | 0 |
| 0.7625000000000001 | 0 |
| 0.7631944444444444 | 0 |
| 0.7638888888888888 | 0 |
| 0.7645833333333334 | 0 |
| 0.7652777777777778 | 0 |
| 0.7659722222222222 | 0 |
| 0.7666666666666666 | 0 |
| 0.7673611111111112 | 0 |
| 0.7680555555555556 | 0 |
| 0.7687499999999999 | 0 |
| 0.7694444444444444 | 0 |
| 0.7701388888888889 | 0 |
| 0.7708333333333334 | 0 |
| 0.7715277777777777 | 0 |
| 0.7722222222222223 | 0 |
| 0.7729166666666667 | 0 |
| 0.7736111111111111 | 0 |
| 0.7743055555555555 | 0 |
| 0.775 | 0 |
| 0.7756944444444445 | 0 |
| 0.7763888888888889 | 0 |
| 0.7770833333333332 | 0 |
| 0.7777777777777778 | 0 |
| 0.7784722222222222 | 0 |
| 0.7791666666666667 | 0 |
| 0.779861111111111 | 0 |
| 0.7805555555555556 | 0 |
| 0.78125 | 0 |
| 0.7819444444444444 | 0 |
| 0.782638888888889 | 0 |
| 0.7833333333333333 | 0 |
| 0.7840277777777778 | 0 |
| 0.7847222222222222 | 0 |
| 0.7854166666666668 | 0 |
| 0.7861111111111111 | 0 |
| 0.7868055555555555 | 0 |
| 0.7875 | 0 |
| 0.7881944444444445 | 0 |
| 0.7888888888888889 | 0 |
| 0.7895833333333333 | 0 |
| 0.7902777777777777 | 0 |
| 0.7909722222222223 | 0 |
| 0.7916666666666666 | 0 |
| 0.7923611111111111 | 0 |
| 0.7930555555555556 | 0 |
| 0.7937500000000001 | 0 |
| 0.7944444444444444 | 0 |
| 0.7951388888888888 | 0 |
| 0.7958333333333334 | 0 |
| 0.7965277777777778 | 0 |
| 0.7972222222222222 | 0 |
| 0.7979166666666666 | 0 |
| 0.7986111111111112 | 0 |
| 0.7993055555555556 | 0 |
| 0.7999999999999999 | 0 |
| 0.8006944444444444 | 0 |
| 0.8013888888888889 | 0 |
| 0.8020833333333334 | 0 |
| 0.8027777777777777 | 0 |
| 0.8034722222222223 | 0 |
| 0.8041666666666667 | 0 |
| 0.8048611111111111 | 0 |
| 0.8055555555555555 | 0 |
| 0.80625 | 0 |
| 0.8069444444444445 | 0 |
| 0.8076388888888889 | 0 |
| 0.8083333333333332 | 0 |
| 0.8090277777777778 | 0 |
| 0.8097222222222222 | 0 |
| 0.8104166666666667 | 0 |
| 0.811111111111111 | 0 |
| 0.8118055555555556 | 0 |
| 0.8125 | 0 |
| 0.8131944444444444 | 0 |
| 0.813888888888889 | 0 |
| 0.8145833333333333 | 0 |
| 0.8152777777777778 | 0 |
| 0.8159722222222222 | 0 |
| 0.8166666666666668 | 0 |
| 0.8173611111111111 | 0 |
| 0.8180555555555555 | 0 |
| 0.81875 | 0 |
| 0.8194444444444445 | 0 |
| 0.8201388888888889 | 0 |
| 0.8208333333333333 | 0 |
| 0.8215277777777777 | 0 |
| 0.8222222222222223 | 0 |
| 0.8229166666666666 | 0 |
| 0.8236111111111111 | 0 |
| 0.8243055555555556 | 0 |
| 0.8250000000000001 | 0 |
| 0.8256944444444444 | 0 |
| 0.8263888888888888 | 0 |
| 0.8270833333333334 | 0 |
| 0.8277777777777778 | 0 |
| 0.8284722222222222 | 0 |
| 0.8291666666666666 | 0 |
| 0.8298611111111112 | 0 |
| 0.8305555555555556 | 0 |
| 0.8312499999999999 | 0 |
| 0.8319444444444444 | 0 |
| 0.8326388888888889 | 0 |
| 0.8333333333333334 | 0 |
| 0.8340277777777777 | 0 |
| 0.8347222222222223 | 0 |
| 0.8354166666666667 | 0 |
| 0.8361111111111111 | 0 |
| 0.8368055555555555 | 0 |
| 0.8375 | 0 |
| 0.8381944444444445 | 0 |
| 0.8388888888888889 | 0 |
| 0.8395833333333332 | 0 |
| 0.8402777777777778 | 0 |
| 0.8409722222222222 | 0 |
| 0.8416666666666667 | 0 |
| 0.842361111111111 | 0 |
| 0.8430555555555556 | 0 |
| 0.84375 | 0 |
| 0.8444444444444444 | 0 |
| 0.845138888888889 | 0 |
| 0.8458333333333333 | 0 |
| 0.8465277777777778 | 0 |
| 0.8472222222222222 | 0 |
| 0.8479166666666668 | 0 |
| 0.8486111111111111 | 0 |
| 0.8493055555555555 | 0 |
| 0.85 | 0 |
| 0.8506944444444445 | 0 |
| 0.8513888888888889 | 0 |
| 0.8520833333333333 | 0 |
| 0.8527777777777777 | 0 |
| 0.8534722222222223 | 0 |
| 0.8541666666666666 | 0 |
| 0.8548611111111111 | 0 |
| 0.8555555555555556 | 0 |
| 0.8562500000000001 | 0 |
| 0.8569444444444444 | 0 |
| 0.8576388888888888 | 0 |
| 0.8583333333333334 | 0 |
| 0.8590277777777778 | 0 |
| 0.8597222222222222 | 0 |
| 0.8604166666666666 | 0 |
| 0.8611111111111112 | 0 |
| 0.8618055555555556 | 0 |
| 0.8624999999999999 | 0 |
| 0.8631944444444444 | 0 |
| 0.8638888888888889 | 0 |
| 0.8645833333333334 | 0 |
| 0.8652777777777777 | 0 |
| 0.8659722222222223 | 0 |
| 0.8666666666666667 | 0 |
| 0.8673611111111111 | 0 |
| 0.8680555555555555 | 0 |
| 0.86875 | 0 |
| 0.8694444444444445 | 0 |
| 0.8701388888888889 | 0 |
| 0.8708333333333332 | 0 |
| 0.8715277777777778 | 0 |
| 0.8722222222222222 | 0 |
| 0.8729166666666667 | 0 |
| 0.873611111111111 | 0 |
| 0.8743055555555556 | 0 |
| 0.875 | 0 |
| 0.8756944444444444 | 0 |
| 0.876388888888889 | 0 |
| 0.8770833333333333 | 0 |
| 0.8777777777777778 | 0 |
| 0.8784722222222222 | 0 |
| 0.8791666666666668 | 0 |
| 0.8798611111111111 | 0 |
| 0.8805555555555555 | 0 |
| 0.88125 | 0 |
| 0.8819444444444445 | 0 |
| 0.8826388888888889 | 0 |
| 0.8833333333333333 | 0 |
| 0.8840277777777777 | 0 |
| 0.8847222222222223 | 0 |
| 0.8854166666666666 | 0 |
| 0.8861111111111111 | 0 |
| 0.8868055555555556 | 0 |
| 0.8875000000000001 | 0 |
| 0.8881944444444444 | 0 |
| 0.8888888888888888 | 0 |
| 0.8895833333333334 | 0 |
| 0.8902777777777778 | 0 |
| 0.8909722222222222 | 0 |
| 0.8916666666666666 | 0 |
| 0.8923611111111112 | 0 |
| 0.8930555555555556 | 0 |
| 0.8937499999999999 | 0 |
| 0.8944444444444444 | 0 |
| 0.8951388888888889 | 0 |
| 0.8958333333333334 | 0 |
| 0.8965277777777777 | 0 |
| 0.8972222222222223 | 0 |
| 0.8979166666666667 | 0 |
| 0.8986111111111111 | 0 |
| 0.8993055555555555 | 0 |
| 0.9 | 0 |
| 0.9006944444444445 | 0 |
| 0.9013888888888889 | 0 |
| 0.9020833333333332 | 0 |
| 0.9027777777777778 | 0 |
| 0.9034722222222222 | 0 |
| 0.9041666666666667 | 0 |
| 0.904861111111111 | 0 |
| 0.9055555555555556 | 0 |
| 0.90625 | 0 |
| 0.9069444444444444 | 0 |
| 0.907638888888889 | 0 |
| 0.9083333333333333 | 0 |
| 0.9090277777777778 | 0 |
| 0.9097222222222222 | 0 |
| 0.9104166666666668 | 0 |
| 0.9111111111111111 | 0 |
| 0.9118055555555555 | 0 |
| 0.9125 | 0 |
| 0.9131944444444445 | 0 |
| 0.9138888888888889 | 0 |
| 0.9145833333333333 | 0 |
| 0.9152777777777777 | 0 |
| 0.9159722222222223 | 0 |
| 0.9166666666666666 | 0 |
| 0.9173611111111111 | 0 |
| 0.9180555555555556 | 0 |
| 0.9187500000000001 | 0 |
| 0.9194444444444444 | 0 |
| 0.9201388888888888 | 0 |
| 0.9208333333333334 | 0 |
| 0.9215277777777778 | 0 |
| 0.9222222222222222 | 0 |
| 0.9229166666666666 | 0 |
| 0.9236111111111112 | 0 |
| 0.9243055555555556 | 0 |
| 0.9249999999999999 | 0 |
| 0.9256944444444444 | 0 |
| 0.9263888888888889 | 0 |
| 0.9270833333333334 | 0 |
| 0.9277777777777777 | 0 |
| 0.9284722222222223 | 0 |
| 0.9291666666666667 | 0 |
| 0.9298611111111111 | 0 |
| 0.9305555555555555 | 0 |
| 0.93125 | 0 |
| 0.9319444444444445 | 0 |
| 0.9326388888888889 | 0 |
| 0.9333333333333332 | 0 |
| 0.9340277777777778 | 0 |
| 0.9347222222222222 | 0 |
| 0.9354166666666667 | 0 |
| 0.936111111111111 | 0 |
| 0.9368055555555556 | 0 |
| 0.9375 | 0 |
| 0.9381944444444444 | 0 |
| 0.938888888888889 | 0 |
| 0.9395833333333333 | 0 |
| 0.9402777777777778 | 0 |
| 0.9409722222222222 | 0 |
| 0.9416666666666668 | 0 |
| 0.9423611111111111 | 0 |
| 0.9430555555555555 | 0 |
| 0.94375 | 0 |
| 0.9444444444444445 | 0 |
| 0.9451388888888889 | 0 |
| 0.9458333333333333 | 0 |
| 0.9465277777777777 | 0 |
| 0.9472222222222223 | 0 |
| 0.9479166666666666 | 0 |
| 0.9486111111111111 | 0 |
| 0.9493055555555556 | 0 |
| 0.9500000000000001 | 0 |
| 0.9506944444444444 | 0 |
| 0.9513888888888888 | 0 |
| 0.9520833333333334 | 0 |
| 0.9527777777777778 | 0 |
| 0.9534722222222222 | 0 |
| 0.9541666666666666 | 0 |
| 0.9548611111111112 | 0 |
| 0.9555555555555556 | 0 |
| 0.9562499999999999 | 0 |
| 0.9569444444444444 | 0 |
| 0.9576388888888889 | 0 |
| 0.9583333333333334 | 0 |
| 0.9590277777777777 | 0 |
| 0.9597222222222223 | 0 |
| 0.9604166666666667 | 0 |
| 0.9611111111111111 | 0 |
| 0.9618055555555555 | 0 |
| 0.9625 | 0 |
| 0.9631944444444445 | 0 |
| 0.9638888888888889 | 0 |
| 0.9645833333333332 | 0 |
| 0.9652777777777778 | 0 |
| 0.9659722222222222 | 0 |
| 0.9666666666666667 | 0 |
| 0.967361111111111 | 0 |
| 0.9680555555555556 | 0 |
| 0.96875 | 0 |
| 0.9694444444444444 | 0 |
| 0.970138888888889 | 0 |
| 0.9708333333333333 | 0 |
| 0.9715277777777778 | 0 |
| 0.9722222222222222 | 0 |
| 0.9729166666666668 | 0 |
| 0.9736111111111111 | 0 |
| 0.9743055555555555 | 0 |
| 0.975 | 0 |
| 0.9756944444444445 | 0 |
| 0.9763888888888889 | 0 |
| 0.9770833333333333 | 0 |
| 0.9777777777777777 | 0 |
| 0.9784722222222223 | 0 |
| 0.9791666666666666 | 0 |
| 0.9798611111111111 | 0 |
| 0.9805555555555556 | 0 |
| 0.9812500000000001 | 0 |
| 0.9819444444444444 | 0 |
| 0.9826388888888888 | 0 |
| 0.9833333333333334 | 0 |
| 0.9840277777777778 | 0 |
| 0.9847222222222222 | 0 |
| 0.9854166666666666 | 0 |
| 0.9861111111111112 | 0 |
| 0.9868055555555556 | 0 |
| 0.9874999999999999 | 0 |
| 0.9881944444444444 | 0 |
| 0.9888888888888889 | 0 |
| 0.9895833333333334 | 0 |
| 0.9902777777777777 | 0 |
| 0.9909722222222223 | 0 |
| 0.9916666666666667 | 0 |
| 0.9923611111111111 | 0 |
| 0.9930555555555555 | 0 |
| 0.99375 | 0 |
| 0.9944444444444445 | 0 |
| 0.9951388888888889 | 0 |
| 0.9958333333333332 | 0 |
| 0.9965277777777778 | 0 |
| 0.9972222222222222 | 0 |
| 0.9979166666666667 | 0 |
| 0.998611111111111 | 0 |
| 0.9993055555555556 | 0 |